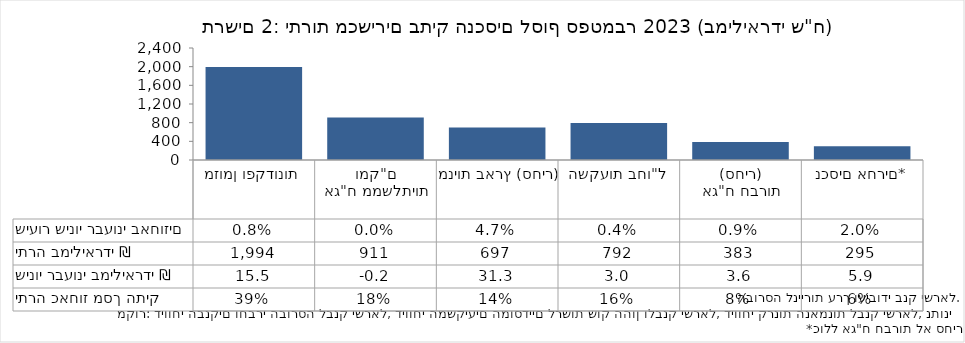
| Category | יתרה במיליארדי ₪   |
|---|---|
| מזומן ופקדונות | 1994.15 |
| אג"ח ממשלתיות ומק"ם | 910.55 |
| מניות בארץ (סחיר) | 696.84 |
| השקעות בחו"ל | 791.93 |
| אג"ח חברות
(סחיר) | 383.11 |
| נכסים אחרים* | 295.12 |